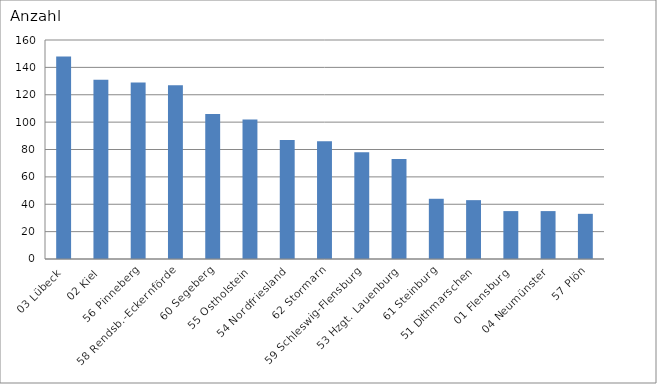
| Category | 03 Lübeck 02 Kiel 56 Pinneberg 58 Rendsb.-Eckernförde 60 Segeberg 55 Ostholstein 54 Nordfriesland 62 Stormarn 59 Schleswig-Flensburg 53 Hzgt. Lauenburg 61 Steinburg 51 Dithmarschen 01 Flensburg 04 Neumünster 57 Plön |
|---|---|
| 03 Lübeck | 148 |
| 02 Kiel | 131 |
| 56 Pinneberg | 129 |
| 58 Rendsb.-Eckernförde | 127 |
| 60 Segeberg | 106 |
| 55 Ostholstein | 102 |
| 54 Nordfriesland | 87 |
| 62 Stormarn | 86 |
| 59 Schleswig-Flensburg | 78 |
| 53 Hzgt. Lauenburg | 73 |
| 61 Steinburg | 44 |
| 51 Dithmarschen | 43 |
| 01 Flensburg | 35 |
| 04 Neumünster | 35 |
| 57 Plön | 33 |